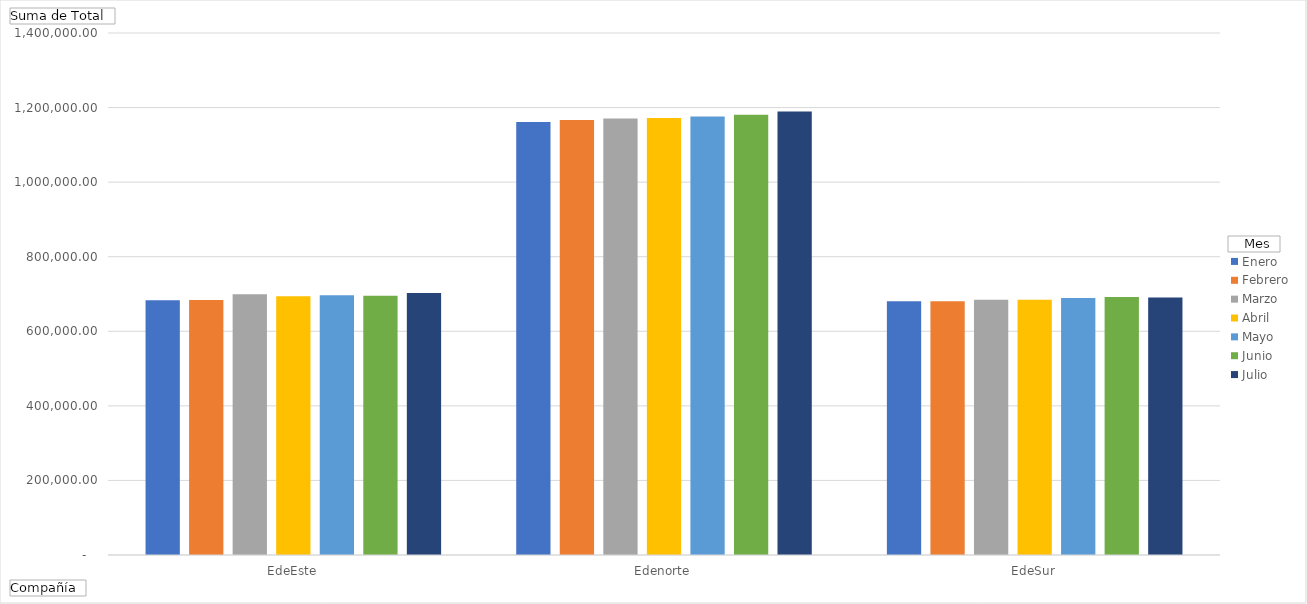
| Category | Enero | Febrero | Marzo | Abril | Mayo | Junio | Julio |
|---|---|---|---|---|---|---|---|
| EdeEste | 683174 | 683943 | 699632 | 693983 | 696851 | 695615 | 702461 |
| Edenorte | 1161561 | 1166486 | 1170763 | 1171986 | 1175800 | 1180517 | 1189326 |
| EdeSur | 680769 | 680482 | 684584 | 684399 | 689171 | 692240 | 690464 |